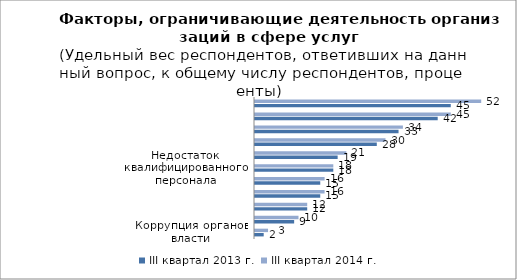
| Category | III квартал 2013 г. | III квартал 2014 г. |
|---|---|---|
| Коррупция органов власти | 2 | 3 |
| Недостаточная нормативно-правовая база, регламентирующая Ваш вид деятельности | 9 | 10 |
| Недостаток помещений/оборудования | 12 | 12 |
| Высокий  % коммерческого кредита | 15 | 16 |
| Высокая арендная плата | 15 | 16 |
| Недостаток квалифицированного персонала | 18 | 18 |
| Недобросовестная конкуренция со стороны других организаций | 19 | 21 |
| Большая отчетная нагрузка | 28 | 30 |
| Существующий уровень налогообложения | 33 | 34 |
| Недостаток финансовых средств | 42 | 45 |